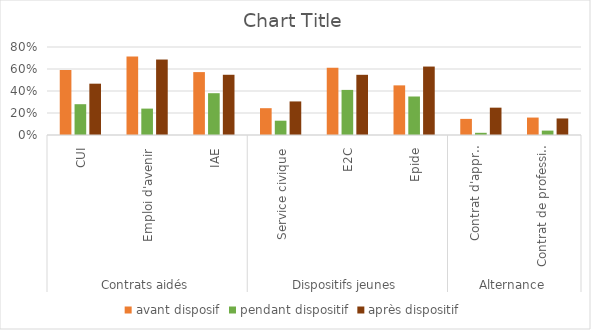
| Category | avant disposif | pendant dispositif | après dispositif |
|---|---|---|---|
| 0 | 0.59 | 0.28 | 0.467 |
| 1 | 0.715 | 0.24 | 0.686 |
| 2 | 0.572 | 0.38 | 0.548 |
| 3 | 0.244 | 0.13 | 0.305 |
| 4 | 0.611 | 0.41 | 0.547 |
| 5 | 0.451 | 0.35 | 0.622 |
| 6 | 0.147 | 0.02 | 0.248 |
| 7 | 0.159 | 0.04 | 0.15 |